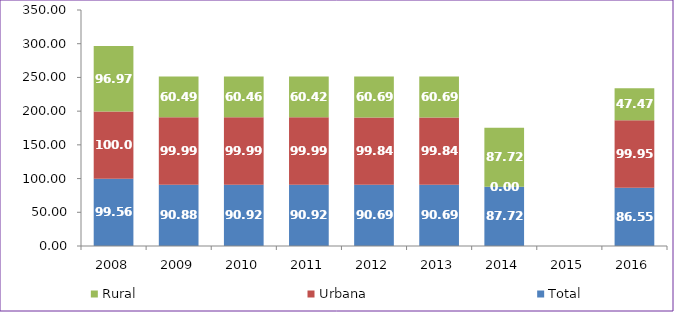
| Category | Total | Urbana | Rural |
|---|---|---|---|
| 2008.0 | 99.56 | 100 | 96.97 |
| 2009.0 | 90.88 | 99.99 | 60.49 |
| 2010.0 | 90.92 | 99.99 | 60.46 |
| 2011.0 | 90.92 | 99.99 | 60.42 |
| 2012.0 | 90.69 | 99.84 | 60.69 |
| 2013.0 | 90.69 | 99.84 | 60.69 |
| 2014.0 | 87.72 | 0 | 87.72 |
| 2015.0 | 0 | 0 | 0 |
| 2016.0 | 86.55 | 99.95 | 47.47 |